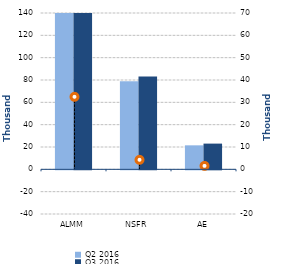
| Category | Q2 2016 | Q3 2016 |
|---|---|---|
| 0 | 601929 | 634401 |
| 1/1/00 | 78844 | 83098 |
| 1/2/00 | 21493 | 23038 |